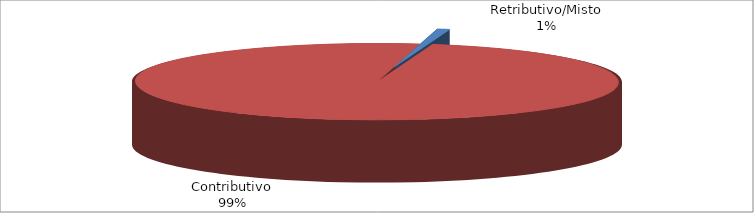
| Category | Series 1 |
|---|---|
| Retributivo/Misto | 316 |
| Contributivo | 38276 |